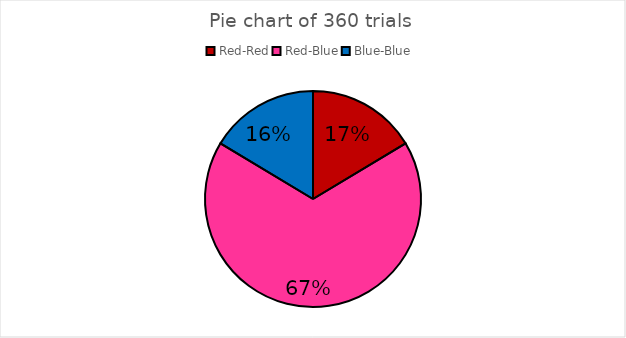
| Category | Fraction |
|---|---|
| Red-Red | 0.164 |
| Red-Blue | 0.672 |
| Blue-Blue | 0.164 |